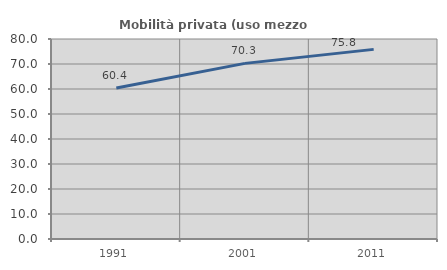
| Category | Mobilità privata (uso mezzo privato) |
|---|---|
| 1991.0 | 60.365 |
| 2001.0 | 70.251 |
| 2011.0 | 75.849 |